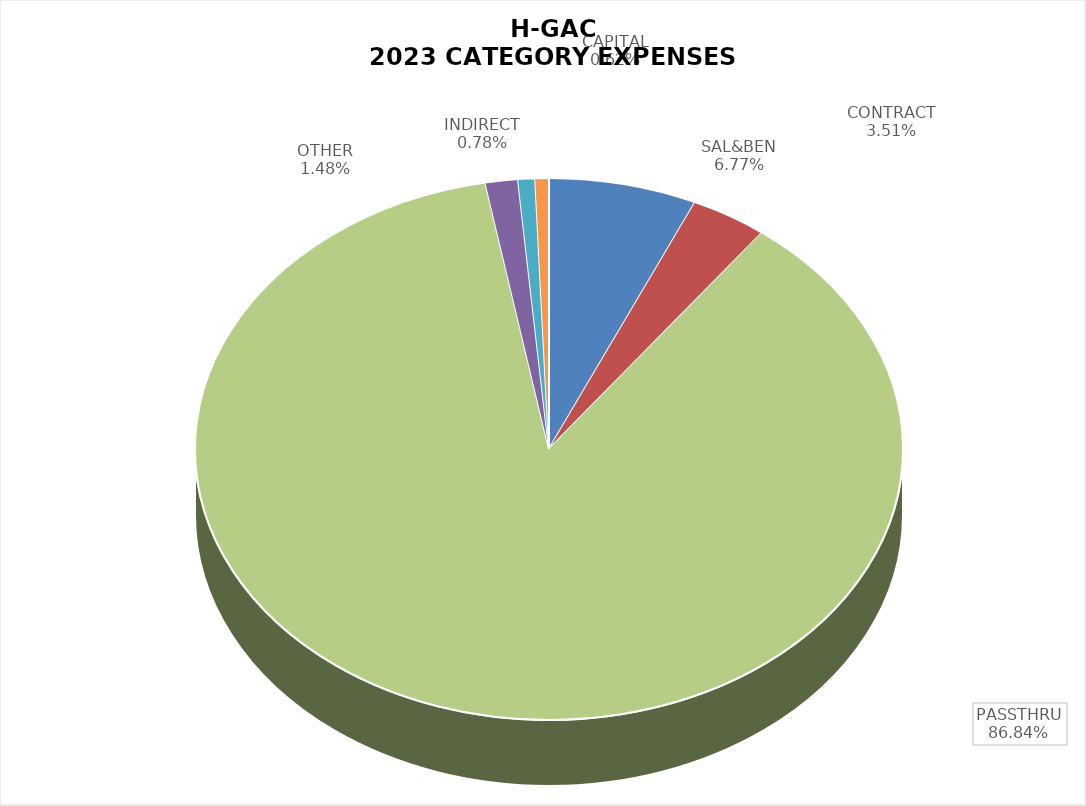
| Category | Series 0 |
|---|---|
| SAL&BEN | 0.068 |
| CONTRACT | 0.035 |
| PASSTHRU | 0.868 |
| OTHER | 0.015 |
| INDIRECT | 0.008 |
| CAPITAL | 0.006 |